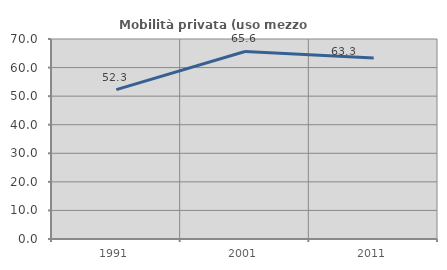
| Category | Mobilità privata (uso mezzo privato) |
|---|---|
| 1991.0 | 52.26 |
| 2001.0 | 65.638 |
| 2011.0 | 63.327 |